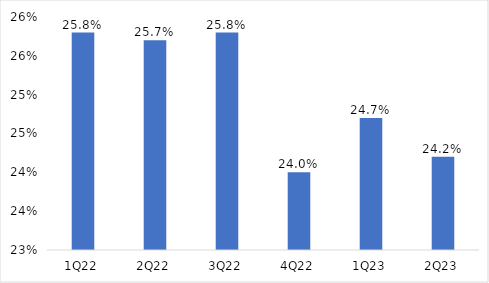
| Category | Series 0 |
|---|---|
| 1Q22 | 0.258 |
| 2Q22 | 0.257 |
| 3Q22 | 0.258 |
| 4Q22 | 0.24 |
| 1Q23 | 0.247 |
| 2Q23 | 0.242 |